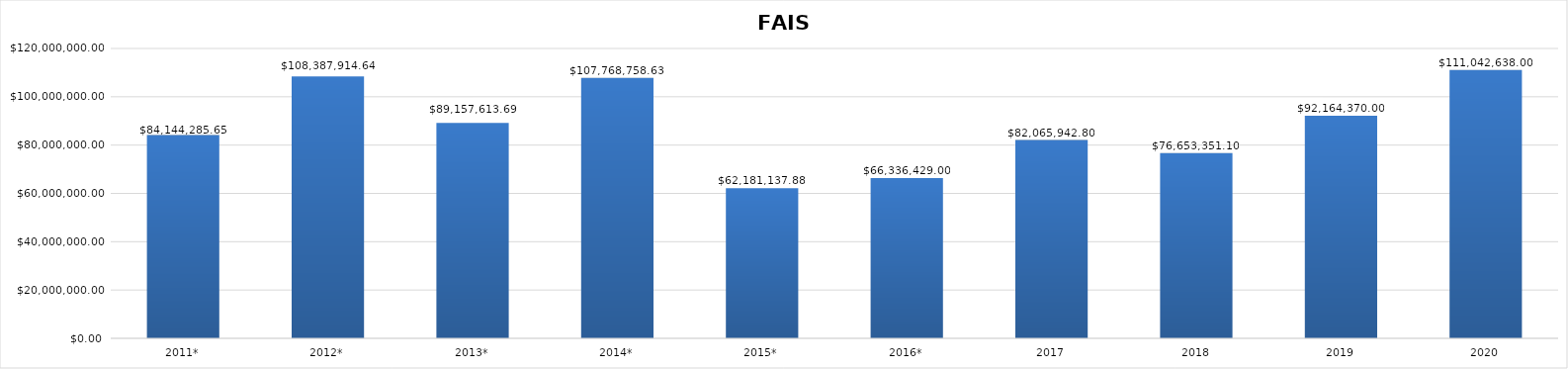
| Category | FAISM |
|---|---|
| 2011* | 84144285.646 |
| 2012* | 108387914.64 |
| 2013* | 89157613.688 |
| 2014* | 107768758.625 |
| 2015* | 62181137.88 |
| 2016* | 66336429 |
| 2017 | 82065942.8 |
| 2018 | 76653351.1 |
| 2019 | 92164370 |
| 2020 | 111042638 |